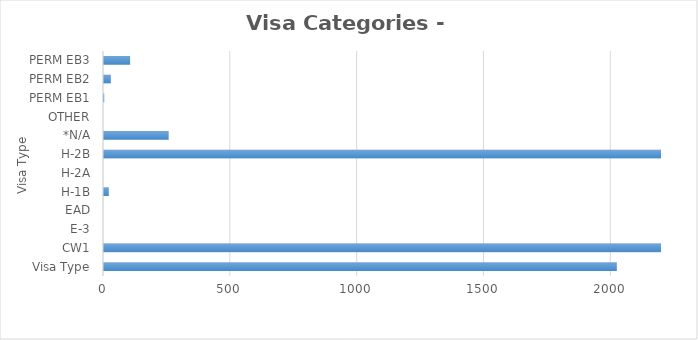
| Category | Series 0 |
|---|---|
| Visa Type | 2022 |
| CW1 | 10846 |
| E-3 | 0 |
| EAD | 0 |
| H-1B | 19 |
| H-2A | 0 |
| H-2B | 7448 |
| *N/A | 255 |
| OTHER | 0 |
| PERM EB1 | 1 |
| PERM EB2 | 27 |
| PERM EB3 | 103 |